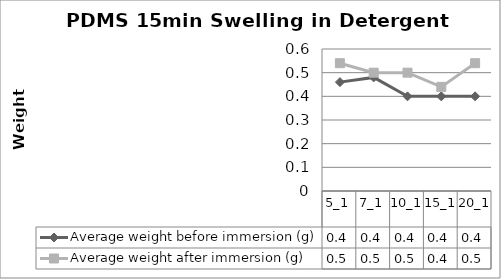
| Category | Average weight before immersion (g) | Average weight after immersion (g) |
|---|---|---|
| 5_1 | 0.46 | 0.54 |
| 7_1 | 0.48 | 0.5 |
| 10_1 | 0.4 | 0.5 |
| 15_1 | 0.4 | 0.44 |
| 20_1 | 0.4 | 0.54 |